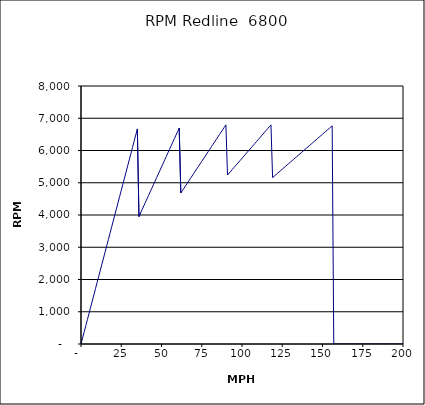
| Category | RPM Redline  6800 |
|---|---|
| 0.0 | 0 |
| 1.0 | 190.538 |
| 2.0 | 381.077 |
| 3.0 | 571.615 |
| 4.0 | 762.153 |
| 5.0 | 952.691 |
| 6.0 | 1143.23 |
| 7.0 | 1333.768 |
| 8.0 | 1524.306 |
| 9.0 | 1714.844 |
| 10.0 | 1905.383 |
| 11.0 | 2095.921 |
| 12.0 | 2286.459 |
| 13.0 | 2476.997 |
| 14.0 | 2667.536 |
| 15.0 | 2858.074 |
| 16.0 | 3048.612 |
| 17.0 | 3239.15 |
| 18.0 | 3429.689 |
| 19.0 | 3620.227 |
| 20.0 | 3810.765 |
| 21.0 | 4001.303 |
| 22.0 | 4191.842 |
| 23.0 | 4382.38 |
| 24.0 | 4572.918 |
| 25.0 | 4763.457 |
| 26.0 | 4953.995 |
| 27.0 | 5144.533 |
| 28.0 | 5335.071 |
| 29.0 | 5525.61 |
| 30.0 | 5716.148 |
| 31.0 | 5906.686 |
| 32.0 | 6097.224 |
| 33.0 | 6287.763 |
| 34.0 | 6478.301 |
| 35.0 | 6668.839 |
| 36.0 | 3952.308 |
| 37.0 | 4062.094 |
| 38.0 | 4171.881 |
| 39.0 | 4281.667 |
| 40.0 | 4391.453 |
| 41.0 | 4501.24 |
| 42.0 | 4611.026 |
| 43.0 | 4720.812 |
| 44.0 | 4830.599 |
| 45.0 | 4940.385 |
| 46.0 | 5050.171 |
| 47.0 | 5159.958 |
| 48.0 | 5269.744 |
| 49.0 | 5379.53 |
| 50.0 | 5489.317 |
| 51.0 | 5599.103 |
| 52.0 | 5708.889 |
| 53.0 | 5818.676 |
| 54.0 | 5928.462 |
| 55.0 | 6038.248 |
| 56.0 | 6148.035 |
| 57.0 | 6257.821 |
| 58.0 | 6367.607 |
| 59.0 | 6477.394 |
| 60.0 | 6587.18 |
| 61.0 | 6696.966 |
| 62.0 | 4681.324 |
| 63.0 | 4756.829 |
| 64.0 | 4832.334 |
| 65.0 | 4907.84 |
| 66.0 | 4983.345 |
| 67.0 | 5058.85 |
| 68.0 | 5134.355 |
| 69.0 | 5209.86 |
| 70.0 | 5285.366 |
| 71.0 | 5360.871 |
| 72.0 | 5436.376 |
| 73.0 | 5511.881 |
| 74.0 | 5587.387 |
| 75.0 | 5662.892 |
| 76.0 | 5738.397 |
| 77.0 | 5813.902 |
| 78.0 | 5889.407 |
| 79.0 | 5964.913 |
| 80.0 | 6040.418 |
| 81.0 | 6115.923 |
| 82.0 | 6191.428 |
| 83.0 | 6266.934 |
| 84.0 | 6342.439 |
| 85.0 | 6417.944 |
| 86.0 | 6493.449 |
| 87.0 | 6568.954 |
| 88.0 | 6644.46 |
| 89.0 | 6719.965 |
| 90.0 | 6795.47 |
| 91.0 | 5239.802 |
| 92.0 | 5297.382 |
| 93.0 | 5354.963 |
| 94.0 | 5412.543 |
| 95.0 | 5470.123 |
| 96.0 | 5527.703 |
| 97.0 | 5585.284 |
| 98.0 | 5642.864 |
| 99.0 | 5700.444 |
| 100.0 | 5758.024 |
| 101.0 | 5815.605 |
| 102.0 | 5873.185 |
| 103.0 | 5930.765 |
| 104.0 | 5988.345 |
| 105.0 | 6045.926 |
| 106.0 | 6103.506 |
| 107.0 | 6161.086 |
| 108.0 | 6218.666 |
| 109.0 | 6276.247 |
| 110.0 | 6333.827 |
| 111.0 | 6391.407 |
| 112.0 | 6448.987 |
| 113.0 | 6506.568 |
| 114.0 | 6564.148 |
| 115.0 | 6621.728 |
| 116.0 | 6679.308 |
| 117.0 | 6736.889 |
| 118.0 | 6794.469 |
| 119.0 | 5160.302 |
| 120.0 | 5203.666 |
| 121.0 | 5247.029 |
| 122.0 | 5290.393 |
| 123.0 | 5333.757 |
| 124.0 | 5377.121 |
| 125.0 | 5420.485 |
| 126.0 | 5463.849 |
| 127.0 | 5507.213 |
| 128.0 | 5550.577 |
| 129.0 | 5593.941 |
| 130.0 | 5637.304 |
| 131.0 | 5680.668 |
| 132.0 | 5724.032 |
| 133.0 | 5767.396 |
| 134.0 | 5810.76 |
| 135.0 | 5854.124 |
| 136.0 | 5897.488 |
| 137.0 | 5940.852 |
| 138.0 | 5984.215 |
| 139.0 | 6027.579 |
| 140.0 | 6070.943 |
| 141.0 | 6114.307 |
| 142.0 | 6157.671 |
| 143.0 | 6201.035 |
| 144.0 | 6244.399 |
| 145.0 | 6287.763 |
| 146.0 | 6331.126 |
| 147.0 | 6374.49 |
| 148.0 | 6417.854 |
| 149.0 | 6461.218 |
| 150.0 | 6504.582 |
| 151.0 | 6547.946 |
| 152.0 | 6591.31 |
| 153.0 | 6634.674 |
| 154.0 | 6678.038 |
| 155.0 | 6721.401 |
| 156.0 | 6764.765 |
| 157.0 | 0 |
| 158.0 | 0 |
| 159.0 | 0 |
| 160.0 | 0 |
| 161.0 | 0 |
| 162.0 | 0 |
| 163.0 | 0 |
| 164.0 | 0 |
| 165.0 | 0 |
| 166.0 | 0 |
| 167.0 | 0 |
| 168.0 | 0 |
| 169.0 | 0 |
| 170.0 | 0 |
| 171.0 | 0 |
| 172.0 | 0 |
| 173.0 | 0 |
| 174.0 | 0 |
| 175.0 | 0 |
| 176.0 | 0 |
| 177.0 | 0 |
| 178.0 | 0 |
| 179.0 | 0 |
| 180.0 | 0 |
| 181.0 | 0 |
| 182.0 | 0 |
| 183.0 | 0 |
| 184.0 | 0 |
| 185.0 | 0 |
| 186.0 | 0 |
| 187.0 | 0 |
| 188.0 | 0 |
| 189.0 | 0 |
| 190.0 | 0 |
| 191.0 | 0 |
| 192.0 | 0 |
| 193.0 | 0 |
| 194.0 | 0 |
| 195.0 | 0 |
| 196.0 | 0 |
| 197.0 | 0 |
| 198.0 | 0 |
| 199.0 | 0 |
| 200.0 | 0 |